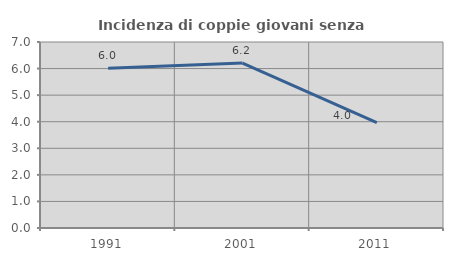
| Category | Incidenza di coppie giovani senza figli |
|---|---|
| 1991.0 | 6.009 |
| 2001.0 | 6.205 |
| 2011.0 | 3.966 |